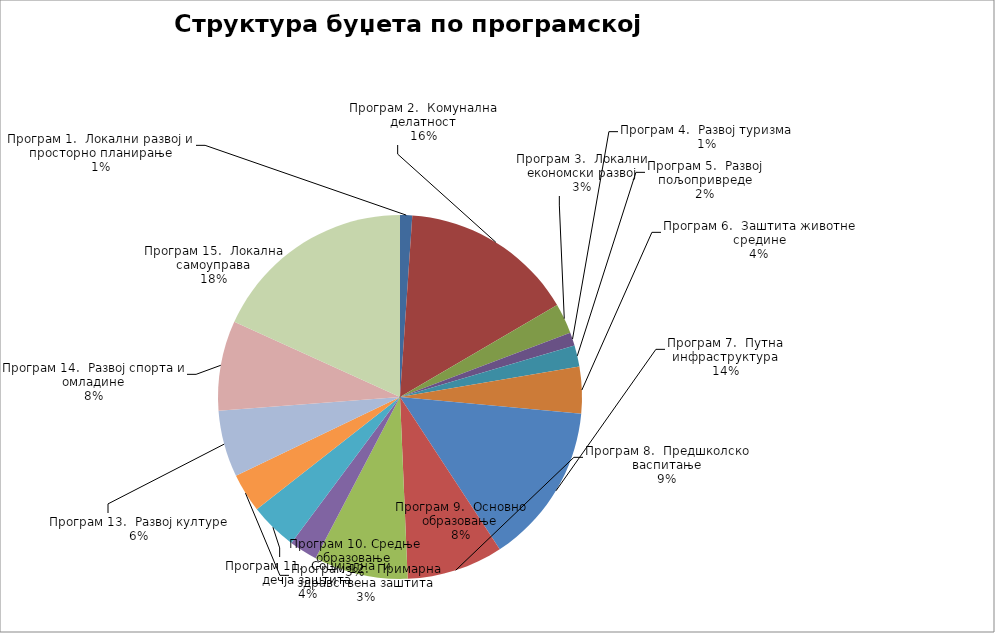
| Category | Series 0 |
|---|---|
| Програм 1.  Локални развој и просторно планирање | 9700000 |
| Програм 2.  Комунална делатност | 139300000 |
| Програм 3.  Локални економски развој | 24090000 |
| Програм 4.  Развој туризма | 10500000 |
| Програм 5.  Развој пољопривреде | 17000000 |
| Програм 6.  Заштита животне средине | 37250000 |
| Програм 7.  Путна инфраструктура | 128600000 |
| Програм 8.  Предшколско васпитање | 76920000 |
| Програм 9.  Основно образовање | 75000000 |
| Програм 10. Средње образовање | 22600000 |
| Програм 11.  Социјална  и дечја заштита | 37960000 |
| Програм 12.  Примарна здравствена заштита | 31100000 |
| Програм 13.  Развој културе | 53251000 |
| Програм 14.  Развој спорта и омладине | 71750000 |
| Програм 15.  Локална самоуправа | 163779000 |